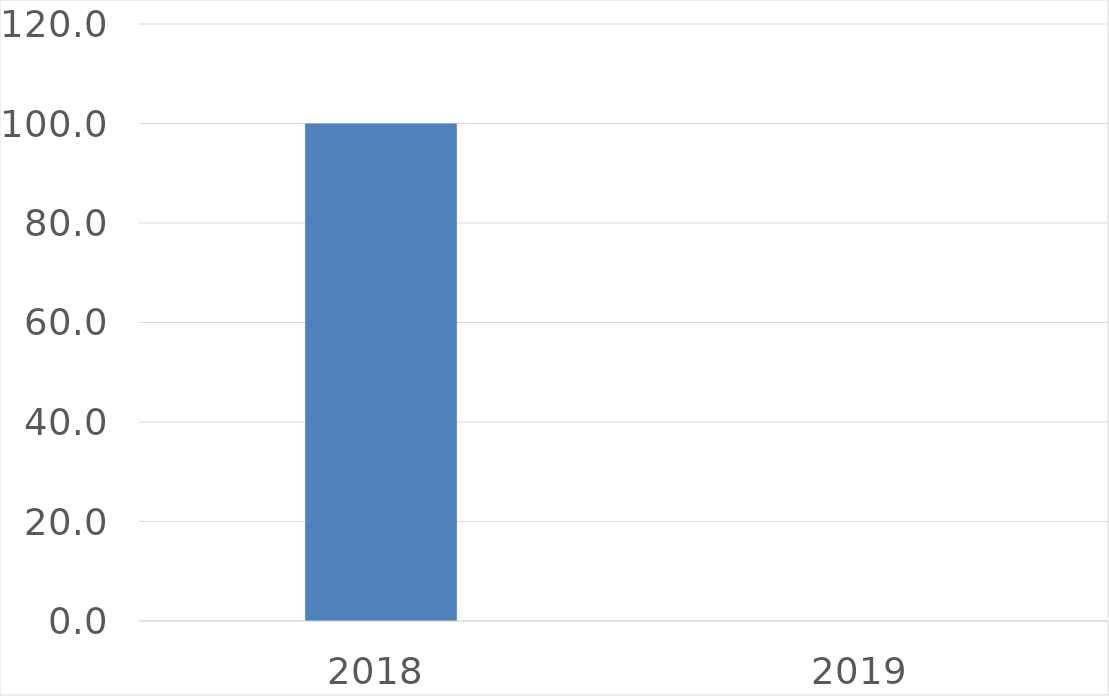
| Category | Series 0 |
|---|---|
| 2018 | 100 |
| 2019 | 0 |